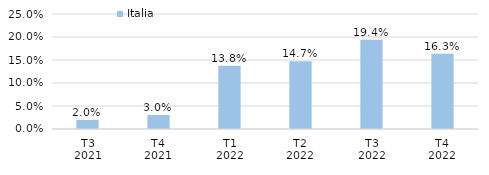
| Category | Italia |
|---|---|
| T3
2021 | 0.02 |
| T4
2021 | 0.03 |
| T1
2022 | 0.138 |
| T2
2022 | 0.147 |
| T3
2022 | 0.194 |
| T4
2022 | 0.163 |